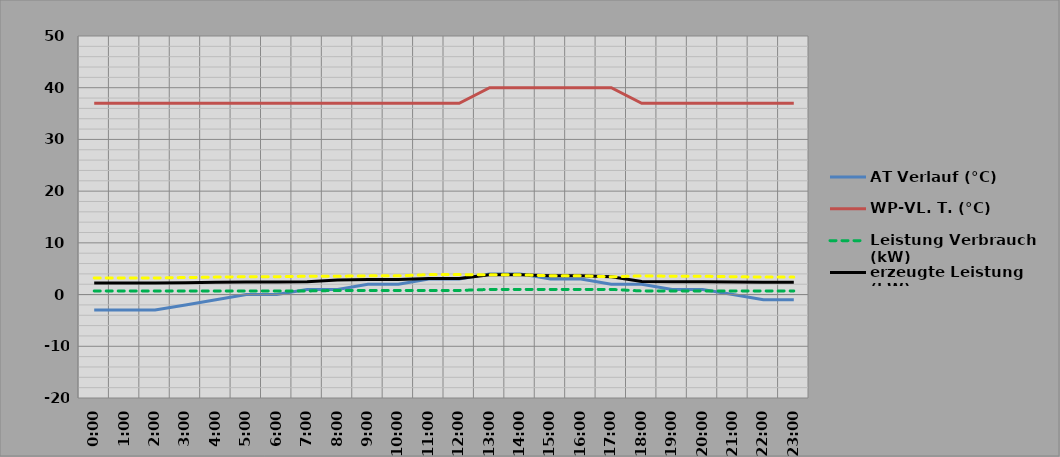
| Category | AT Verlauf (°C) | WP-VL. T. (°C) | Leistung Verbrauch (kW) | erzeugte Leistung (kW) | COP (pro Std.) |
|---|---|---|---|---|---|
| 0.0 | -3 | 37 | 0.7 | 2.248 | 3.212 |
| 0.0416666666666667 | -3 | 37 | 0.7 | 2.248 | 3.212 |
| 0.0833333333333333 | -3 | 37 | 0.7 | 2.248 | 3.212 |
| 0.125 | -2 | 37 | 0.7 | 2.306 | 3.294 |
| 0.166666666666667 | -1 | 37 | 0.7 | 2.363 | 3.376 |
| 0.208333333333333 | 0 | 37 | 0.7 | 2.421 | 3.458 |
| 0.25 | 0 | 37 | 0.7 | 2.421 | 3.458 |
| 0.291666666666667 | 1 | 37 | 0.7 | 2.478 | 3.54 |
| 0.333333333333333 | 1 | 37 | 0.8 | 2.832 | 3.54 |
| 0.375 | 2 | 37 | 0.8 | 2.898 | 3.622 |
| 0.416666666666667 | 2 | 37 | 0.8 | 2.898 | 3.622 |
| 0.458333333333333 | 3 | 37 | 0.8 | 3.089 | 3.861 |
| 0.5 | 3 | 37 | 0.8 | 3.089 | 3.861 |
| 0.541666666666667 | 4 | 40 | 1 | 3.826 | 3.826 |
| 0.583333333333333 | 4 | 40 | 1 | 3.826 | 3.826 |
| 0.625 | 3 | 40 | 1 | 3.628 | 3.628 |
| 0.666666666666667 | 3 | 40 | 1 | 3.628 | 3.628 |
| 0.708333333333333 | 2 | 40 | 1 | 3.43 | 3.43 |
| 0.75 | 2 | 37 | 0.7 | 2.535 | 3.622 |
| 0.791666666666667 | 1 | 37 | 0.7 | 2.478 | 3.54 |
| 0.833333333333333 | 1 | 37 | 0.7 | 2.478 | 3.54 |
| 0.875 | 0 | 37 | 0.7 | 2.421 | 3.458 |
| 0.916666666666667 | -1 | 37 | 0.7 | 2.363 | 3.376 |
| 0.958333333333333 | -1 | 37 | 0.7 | 2.363 | 3.376 |